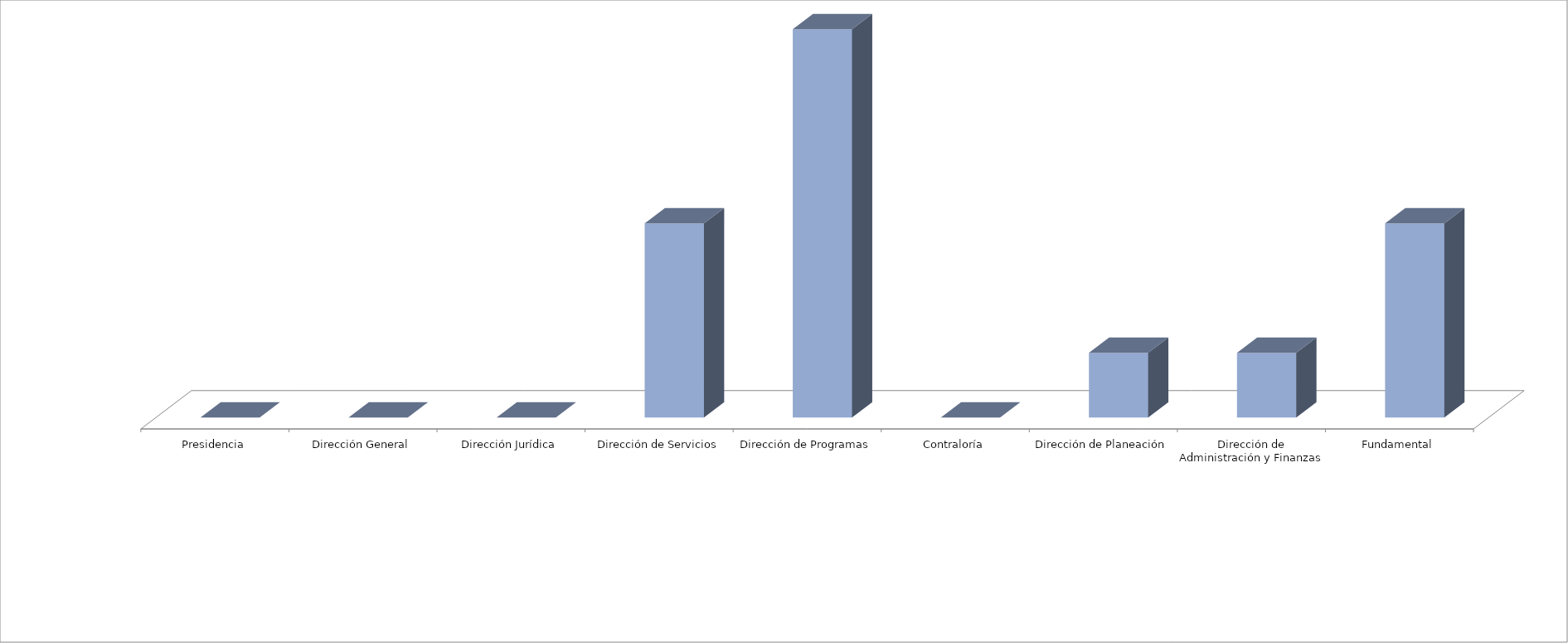
| Category | Series 0 | Series 1 |
|---|---|---|
| Presidencia |  | 0 |
| Dirección General |  | 0 |
| Dirección Jurídica |  | 0 |
| Dirección de Servicios |  | 3 |
| Dirección de Programas |  | 6 |
| Contraloría |  | 0 |
| Dirección de Planeación |  | 1 |
| Dirección de Administración y Finanzas |  | 1 |
| Fundamental |  | 3 |